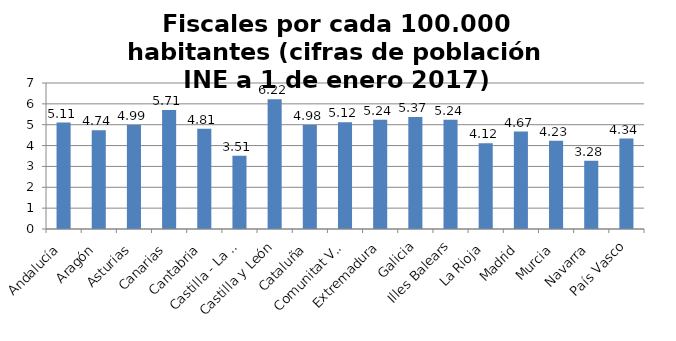
| Category | Fiscales por cada 100.000 habitantes |
|---|---|
| Andalucía | 5.106 |
| Aragón | 4.738 |
| Asturias | 4.987 |
| Canarias | 5.709 |
| Cantabria | 4.809 |
| Castilla - La Mancha | 3.514 |
| Castilla y León | 6.221 |
| Cataluña | 4.985 |
| Comunitat Valenciana | 5.121 |
| Extremadura | 5.24 |
| Galicia | 5.371 |
| Illes Balears | 5.238 |
| La Rioja | 4.117 |
| Madrid | 4.67 |
| Murcia | 4.233 |
| Navarra | 3.278 |
| País Vasco | 4.339 |